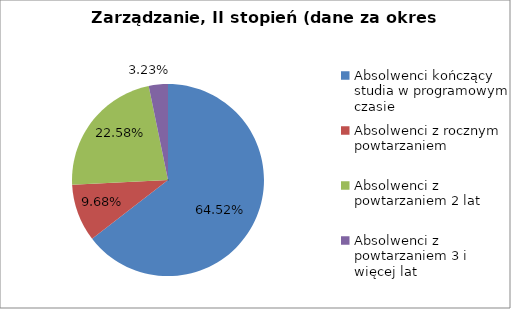
| Category | Series 0 |
|---|---|
| Absolwenci kończący studia w programowym czasie | 64.516 |
| Absolwenci z rocznym powtarzaniem | 9.677 |
| Absolwenci z powtarzaniem 2 lat | 22.581 |
| Absolwenci z powtarzaniem 3 i więcej lat | 3.226 |